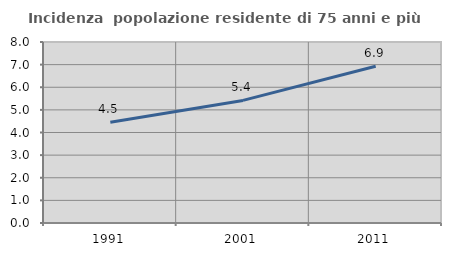
| Category | Incidenza  popolazione residente di 75 anni e più |
|---|---|
| 1991.0 | 4.455 |
| 2001.0 | 5.419 |
| 2011.0 | 6.929 |